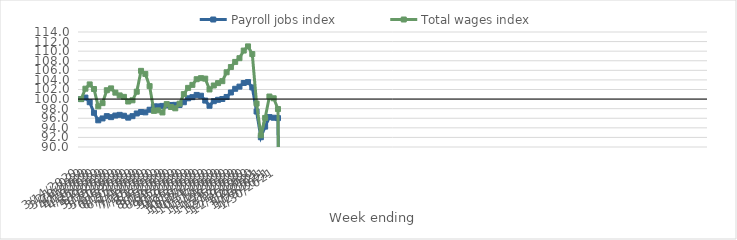
| Category | Payroll jobs index | Total wages index |
|---|---|---|
| 14/03/2020 | 100 | 100 |
| 21/03/2020 | 100.316 | 102.168 |
| 28/03/2020 | 99.347 | 103.06 |
| 04/04/2020 | 97.137 | 102.102 |
| 11/04/2020 | 95.569 | 98.483 |
| 18/04/2020 | 95.959 | 99.156 |
| 25/04/2020 | 96.442 | 101.848 |
| 02/05/2020 | 96.229 | 102.231 |
| 09/05/2020 | 96.564 | 101.342 |
| 16/05/2020 | 96.708 | 100.767 |
| 23/05/2020 | 96.52 | 100.464 |
| 30/05/2020 | 96.128 | 99.494 |
| 06/06/2020 | 96.439 | 99.744 |
| 13/06/2020 | 96.995 | 101.542 |
| 20/06/2020 | 97.3 | 105.892 |
| 27/06/2020 | 97.228 | 105.252 |
| 04/07/2020 | 97.776 | 102.704 |
| 11/07/2020 | 98.478 | 97.538 |
| 18/07/2020 | 98.473 | 97.649 |
| 25/07/2020 | 98.575 | 97.212 |
| 01/08/2020 | 98.673 | 98.953 |
| 08/08/2020 | 98.774 | 98.345 |
| 15/08/2020 | 98.801 | 98.077 |
| 22/08/2020 | 98.776 | 99.038 |
| 29/08/2020 | 99.345 | 101.034 |
| 05/09/2020 | 100.161 | 102.342 |
| 12/09/2020 | 100.402 | 102.971 |
| 19/09/2020 | 100.868 | 104.146 |
| 26/09/2020 | 100.7 | 104.365 |
| 03/10/2020 | 99.685 | 104.265 |
| 10/10/2020 | 98.606 | 102.008 |
| 17/10/2020 | 99.559 | 102.835 |
| 24/10/2020 | 99.849 | 103.335 |
| 31/10/2020 | 100.02 | 103.738 |
| 07/11/2020 | 100.441 | 105.595 |
| 14/11/2020 | 101.379 | 106.688 |
| 21/11/2020 | 102.153 | 107.758 |
| 28/11/2020 | 102.6 | 108.536 |
| 05/12/2020 | 103.359 | 110.125 |
| 12/12/2020 | 103.547 | 110.998 |
| 19/12/2020 | 102.436 | 109.388 |
| 26/12/2020 | 97.407 | 99.055 |
| 02/01/2021 | 92.043 | 92.438 |
| 09/01/2021 | 94.253 | 96.068 |
| 16/01/2021 | 96.243 | 100.534 |
| 23/01/2021 | 96.11 | 100.166 |
| 30/01/2021 | 96.031 | 97.923 |